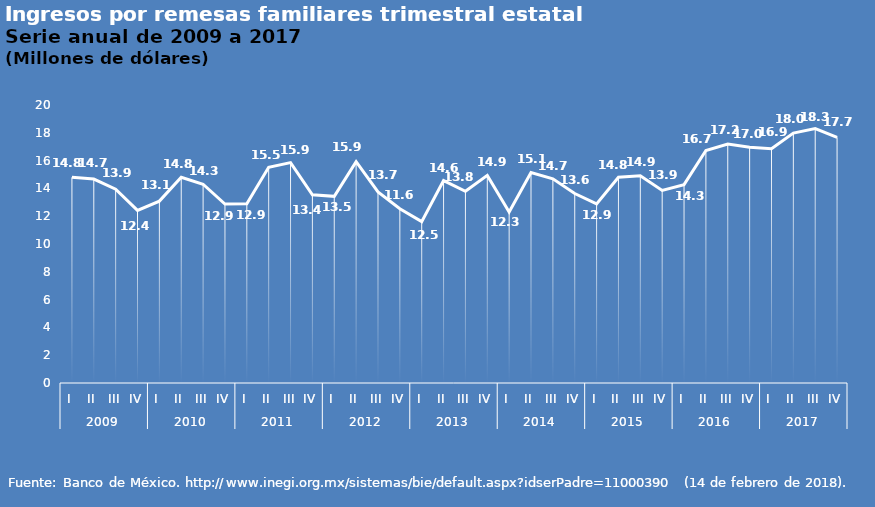
| Category | Series 0 |
|---|---|
| 0 | 14.797 |
| 1 | 14.669 |
| 2 | 13.94 |
| 3 | 12.418 |
| 4 | 13.085 |
| 5 | 14.797 |
| 6 | 14.3 |
| 7 | 12.873 |
| 8 | 12.896 |
| 9 | 15.524 |
| 10 | 15.858 |
| 11 | 13.537 |
| 12 | 13.428 |
| 13 | 15.919 |
| 14 | 13.741 |
| 15 | 12.532 |
| 16 | 11.612 |
| 17 | 14.561 |
| 18 | 13.789 |
| 19 | 14.938 |
| 20 | 12.298 |
| 21 | 15.144 |
| 22 | 14.691 |
| 23 | 13.634 |
| 24 | 12.883 |
| 25 | 14.804 |
| 26 | 14.904 |
| 27 | 13.854 |
| 28 | 14.274 |
| 29 | 16.726 |
| 30 | 17.189 |
| 31 | 16.955 |
| 32 | 16.854 |
| 33 | 17.983 |
| 34 | 18.302 |
| 35 | 17.676 |